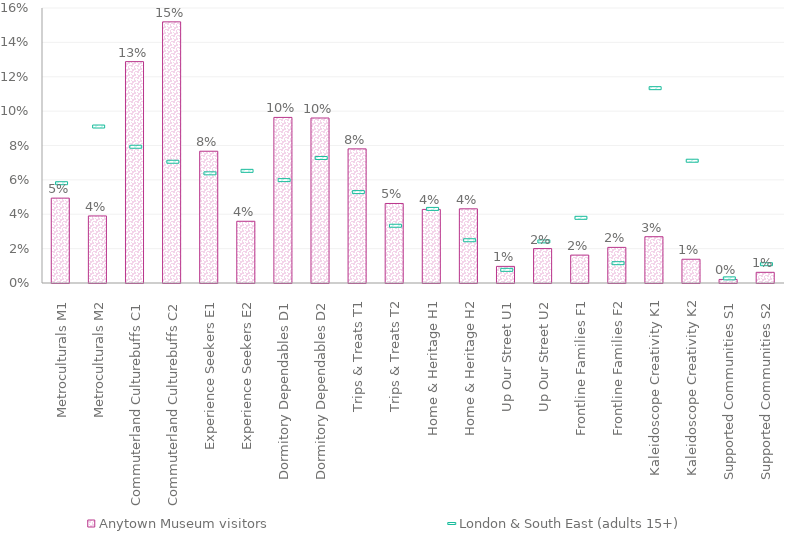
| Category | Anytown Museum visitors |
|---|---|
| Metroculturals M1 | 0.049 |
| Metroculturals M2 | 0.039 |
| Commuterland Culturebuffs C1 | 0.129 |
| Commuterland Culturebuffs C2 | 0.152 |
| Experience Seekers E1 | 0.077 |
| Experience Seekers E2 | 0.036 |
| Dormitory Dependables D1 | 0.096 |
| Dormitory Dependables D2 | 0.096 |
| Trips & Treats T1 | 0.078 |
| Trips & Treats T2 | 0.046 |
| Home & Heritage H1 | 0.043 |
| Home & Heritage H2 | 0.043 |
| Up Our Street U1 | 0.01 |
| Up Our Street U2 | 0.02 |
| Frontline Families F1 | 0.016 |
| Frontline Families F2 | 0.021 |
| Kaleidoscope Creativity K1 | 0.027 |
| Kaleidoscope Creativity K2 | 0.014 |
| Supported Communities S1 | 0.002 |
| Supported Communities S2 | 0.006 |